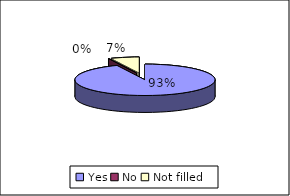
| Category | During the procedure did the doctor explain to you what she was doing |
|---|---|
| Yes | 57 |
| No | 0 |
| Not filled | 4 |